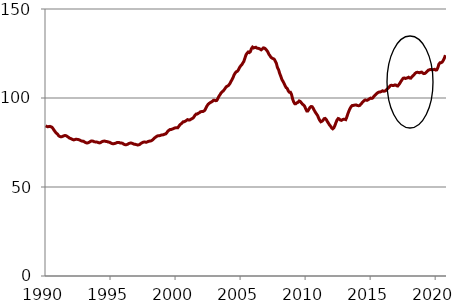
| Category | Series 0 |
|---|---|
| 1990-01-01 | 84.396 |
| 1990-02-01 | 84.066 |
| 1990-03-01 | 83.831 |
| 1990-04-01 | 83.972 |
| 1990-05-01 | 84.059 |
| 1990-06-01 | 83.83 |
| 1990-07-01 | 83.566 |
| 1990-08-01 | 82.717 |
| 1990-09-01 | 81.766 |
| 1990-10-01 | 80.944 |
| 1990-11-01 | 80.205 |
| 1990-12-01 | 79.775 |
| 1991-01-01 | 78.843 |
| 1991-02-01 | 78.432 |
| 1991-03-01 | 78.2 |
| 1991-04-01 | 78.268 |
| 1991-05-01 | 78.507 |
| 1991-06-01 | 78.777 |
| 1991-07-01 | 78.933 |
| 1991-08-01 | 78.781 |
| 1991-09-01 | 78.418 |
| 1991-10-01 | 78.007 |
| 1991-11-01 | 77.521 |
| 1991-12-01 | 77.275 |
| 1992-01-01 | 77.017 |
| 1992-02-01 | 76.694 |
| 1992-03-01 | 76.469 |
| 1992-04-01 | 76.627 |
| 1992-05-01 | 76.838 |
| 1992-06-01 | 76.768 |
| 1992-07-01 | 76.713 |
| 1992-08-01 | 76.515 |
| 1992-09-01 | 76.196 |
| 1992-10-01 | 75.897 |
| 1992-11-01 | 75.771 |
| 1992-12-01 | 75.712 |
| 1993-01-01 | 75.273 |
| 1993-02-01 | 74.944 |
| 1993-03-01 | 74.737 |
| 1993-04-01 | 74.801 |
| 1993-05-01 | 75.056 |
| 1993-06-01 | 75.424 |
| 1993-07-01 | 75.783 |
| 1993-08-01 | 75.812 |
| 1993-09-01 | 75.72 |
| 1993-10-01 | 75.383 |
| 1993-11-01 | 75.33 |
| 1993-12-01 | 75.276 |
| 1994-01-01 | 75.152 |
| 1994-02-01 | 74.903 |
| 1994-03-01 | 74.786 |
| 1994-04-01 | 75.02 |
| 1994-05-01 | 75.453 |
| 1994-06-01 | 75.665 |
| 1994-07-01 | 75.804 |
| 1994-08-01 | 75.737 |
| 1994-09-01 | 75.556 |
| 1994-10-01 | 75.472 |
| 1994-11-01 | 75.244 |
| 1994-12-01 | 75.159 |
| 1995-01-01 | 74.811 |
| 1995-02-01 | 74.481 |
| 1995-03-01 | 74.316 |
| 1995-04-01 | 74.341 |
| 1995-05-01 | 74.493 |
| 1995-06-01 | 74.693 |
| 1995-07-01 | 75.009 |
| 1995-08-01 | 75.036 |
| 1995-09-01 | 74.966 |
| 1995-10-01 | 74.712 |
| 1995-11-01 | 74.673 |
| 1995-12-01 | 74.614 |
| 1996-01-01 | 74.1 |
| 1996-02-01 | 73.836 |
| 1996-03-01 | 73.696 |
| 1996-04-01 | 73.826 |
| 1996-05-01 | 74.112 |
| 1996-06-01 | 74.466 |
| 1996-07-01 | 74.655 |
| 1996-08-01 | 74.715 |
| 1996-09-01 | 74.528 |
| 1996-10-01 | 74.229 |
| 1996-11-01 | 74.024 |
| 1996-12-01 | 73.965 |
| 1997-01-01 | 73.768 |
| 1997-02-01 | 73.595 |
| 1997-03-01 | 73.688 |
| 1997-04-01 | 73.955 |
| 1997-05-01 | 74.478 |
| 1997-06-01 | 74.853 |
| 1997-07-01 | 75.148 |
| 1997-08-01 | 75.278 |
| 1997-09-01 | 75.23 |
| 1997-10-01 | 75.128 |
| 1997-11-01 | 75.369 |
| 1997-12-01 | 75.651 |
| 1998-01-01 | 75.785 |
| 1998-02-01 | 75.827 |
| 1998-03-01 | 76.124 |
| 1998-04-01 | 76.571 |
| 1998-05-01 | 77.134 |
| 1998-06-01 | 77.746 |
| 1998-07-01 | 78.223 |
| 1998-08-01 | 78.598 |
| 1998-09-01 | 78.799 |
| 1998-10-01 | 78.82 |
| 1998-11-01 | 78.989 |
| 1998-12-01 | 79.248 |
| 1999-01-01 | 79.285 |
| 1999-02-01 | 79.416 |
| 1999-03-01 | 79.712 |
| 1999-04-01 | 79.835 |
| 1999-05-01 | 80.617 |
| 1999-06-01 | 81.465 |
| 1999-07-01 | 81.92 |
| 1999-08-01 | 82.317 |
| 1999-09-01 | 82.346 |
| 1999-10-01 | 82.561 |
| 1999-11-01 | 82.776 |
| 1999-12-01 | 83.105 |
| 2000-01-01 | 83.235 |
| 2000-02-01 | 83.217 |
| 2000-03-01 | 83.271 |
| 2000-04-01 | 84.103 |
| 2000-05-01 | 84.956 |
| 2000-06-01 | 85.452 |
| 2000-07-01 | 85.959 |
| 2000-08-01 | 86.609 |
| 2000-09-01 | 86.657 |
| 2000-10-01 | 86.986 |
| 2000-11-01 | 87.39 |
| 2000-12-01 | 87.845 |
| 2001-01-01 | 87.632 |
| 2001-02-01 | 87.625 |
| 2001-03-01 | 88.026 |
| 2001-04-01 | 88.355 |
| 2001-05-01 | 88.713 |
| 2001-06-01 | 89.408 |
| 2001-07-01 | 90.416 |
| 2001-08-01 | 91.018 |
| 2001-09-01 | 90.985 |
| 2001-10-01 | 91.463 |
| 2001-11-01 | 91.742 |
| 2001-12-01 | 92.278 |
| 2002-01-01 | 92.373 |
| 2002-02-01 | 92.39 |
| 2002-03-01 | 92.669 |
| 2002-04-01 | 93.153 |
| 2002-05-01 | 94.387 |
| 2002-06-01 | 95.54 |
| 2002-07-01 | 96.49 |
| 2002-08-01 | 96.98 |
| 2002-09-01 | 97.412 |
| 2002-10-01 | 97.749 |
| 2002-11-01 | 98.141 |
| 2002-12-01 | 98.753 |
| 2003-01-01 | 98.706 |
| 2003-02-01 | 98.47 |
| 2003-03-01 | 98.631 |
| 2003-04-01 | 99.747 |
| 2003-05-01 | 100.944 |
| 2003-06-01 | 101.894 |
| 2003-07-01 | 102.869 |
| 2003-08-01 | 103.482 |
| 2003-09-01 | 103.99 |
| 2003-10-01 | 104.786 |
| 2003-11-01 | 105.672 |
| 2003-12-01 | 106.445 |
| 2004-01-01 | 106.745 |
| 2004-02-01 | 107.171 |
| 2004-03-01 | 108.022 |
| 2004-04-01 | 109.245 |
| 2004-05-01 | 110.21 |
| 2004-06-01 | 111.478 |
| 2004-07-01 | 113.004 |
| 2004-08-01 | 114.039 |
| 2004-09-01 | 114.757 |
| 2004-10-01 | 115.033 |
| 2004-11-01 | 115.855 |
| 2004-12-01 | 117.148 |
| 2005-01-01 | 117.978 |
| 2005-02-01 | 118.616 |
| 2005-03-01 | 119.622 |
| 2005-04-01 | 120.572 |
| 2005-05-01 | 122.536 |
| 2005-06-01 | 124.258 |
| 2005-07-01 | 125.182 |
| 2005-08-01 | 125.851 |
| 2005-09-01 | 125.524 |
| 2005-10-01 | 126.078 |
| 2005-11-01 | 127.754 |
| 2005-12-01 | 128.583 |
| 2006-01-01 | 128.121 |
| 2006-02-01 | 128.338 |
| 2006-03-01 | 128.51 |
| 2006-04-01 | 128.052 |
| 2006-05-01 | 127.928 |
| 2006-06-01 | 127.791 |
| 2006-07-01 | 127.457 |
| 2006-08-01 | 127.067 |
| 2006-09-01 | 127.551 |
| 2006-10-01 | 128.147 |
| 2006-11-01 | 128.043 |
| 2006-12-01 | 127.572 |
| 2007-01-01 | 126.829 |
| 2007-02-01 | 125.983 |
| 2007-03-01 | 124.656 |
| 2007-04-01 | 123.808 |
| 2007-05-01 | 122.89 |
| 2007-06-01 | 122.421 |
| 2007-07-01 | 122.084 |
| 2007-08-01 | 121.796 |
| 2007-09-01 | 120.711 |
| 2007-10-01 | 119.382 |
| 2007-11-01 | 117.094 |
| 2007-12-01 | 115.952 |
| 2008-01-01 | 113.874 |
| 2008-02-01 | 112.293 |
| 2008-03-01 | 110.48 |
| 2008-04-01 | 109.435 |
| 2008-05-01 | 108.325 |
| 2008-06-01 | 106.934 |
| 2008-07-01 | 105.85 |
| 2008-08-01 | 105.354 |
| 2008-09-01 | 103.979 |
| 2008-10-01 | 103.255 |
| 2008-11-01 | 103.226 |
| 2008-12-01 | 101.948 |
| 2009-01-01 | 99.389 |
| 2009-02-01 | 97.742 |
| 2009-03-01 | 96.777 |
| 2009-04-01 | 96.819 |
| 2009-05-01 | 97.346 |
| 2009-06-01 | 97.575 |
| 2009-07-01 | 98.35 |
| 2009-08-01 | 98.075 |
| 2009-09-01 | 97.337 |
| 2009-10-01 | 96.567 |
| 2009-11-01 | 96.081 |
| 2009-12-01 | 95.423 |
| 2010-01-01 | 94.02 |
| 2010-02-01 | 92.734 |
| 2010-03-01 | 92.705 |
| 2010-04-01 | 93.707 |
| 2010-05-01 | 94.687 |
| 2010-06-01 | 95.209 |
| 2010-07-01 | 95.097 |
| 2010-08-01 | 94.233 |
| 2010-09-01 | 93.009 |
| 2010-10-01 | 91.944 |
| 2010-11-01 | 91.066 |
| 2010-12-01 | 90.15 |
| 2011-01-01 | 88.71 |
| 2011-02-01 | 87.447 |
| 2011-03-01 | 86.634 |
| 2011-04-01 | 86.934 |
| 2011-05-01 | 87.479 |
| 2011-06-01 | 88.352 |
| 2011-07-01 | 88.52 |
| 2011-08-01 | 87.932 |
| 2011-09-01 | 86.797 |
| 2011-10-01 | 85.886 |
| 2011-11-01 | 84.876 |
| 2011-12-01 | 84.153 |
| 2012-01-01 | 83.164 |
| 2012-02-01 | 82.695 |
| 2012-03-01 | 83.217 |
| 2012-04-01 | 84.559 |
| 2012-05-01 | 86.233 |
| 2012-06-01 | 87.657 |
| 2012-07-01 | 88.482 |
| 2012-08-01 | 88.249 |
| 2012-09-01 | 87.647 |
| 2012-10-01 | 87.446 |
| 2012-11-01 | 87.858 |
| 2012-12-01 | 88.039 |
| 2013-01-01 | 88.049 |
| 2013-02-01 | 87.848 |
| 2013-03-01 | 89.31 |
| 2013-04-01 | 91.223 |
| 2013-05-01 | 92.807 |
| 2013-06-01 | 94.129 |
| 2013-07-01 | 95.211 |
| 2013-08-01 | 95.761 |
| 2013-09-01 | 95.816 |
| 2013-10-01 | 95.992 |
| 2013-11-01 | 96.071 |
| 2013-12-01 | 96.03 |
| 2014-01-01 | 95.73 |
| 2014-02-01 | 95.68 |
| 2014-03-01 | 95.853 |
| 2014-04-01 | 96.595 |
| 2014-05-01 | 97.272 |
| 2014-06-01 | 97.989 |
| 2014-07-01 | 98.568 |
| 2014-08-01 | 98.917 |
| 2014-09-01 | 98.721 |
| 2014-10-01 | 98.775 |
| 2014-11-01 | 99.163 |
| 2014-12-01 | 99.614 |
| 2015-01-01 | 99.964 |
| 2015-02-01 | 99.764 |
| 2015-03-01 | 100.04 |
| 2015-04-01 | 100.95 |
| 2015-05-01 | 101.545 |
| 2015-06-01 | 102.129 |
| 2015-07-01 | 102.735 |
| 2015-08-01 | 103.143 |
| 2015-09-01 | 103.371 |
| 2015-10-01 | 103.425 |
| 2015-11-01 | 103.703 |
| 2015-12-01 | 104.046 |
| 2016-01-01 | 103.826 |
| 2016-02-01 | 103.884 |
| 2016-03-01 | 104.216 |
| 2016-04-01 | 104.834 |
| 2016-05-01 | 105.492 |
| 2016-06-01 | 106.067 |
| 2016-07-01 | 106.887 |
| 2016-08-01 | 107.163 |
| 2016-09-01 | 107.075 |
| 2016-10-01 | 106.987 |
| 2016-11-01 | 107.279 |
| 2016-12-01 | 107.345 |
| 2017-01-01 | 106.872 |
| 2017-02-01 | 106.751 |
| 2017-03-01 | 107.529 |
| 2017-04-01 | 108.359 |
| 2017-05-01 | 109.412 |
| 2017-06-01 | 110.31 |
| 2017-07-01 | 111.107 |
| 2017-08-01 | 111.257 |
| 2017-09-01 | 110.939 |
| 2017-10-01 | 111.16 |
| 2017-11-01 | 111.366 |
| 2017-12-01 | 111.657 |
| 2018-01-01 | 111.205 |
| 2018-02-01 | 111.149 |
| 2018-03-01 | 111.836 |
| 2018-04-01 | 112.538 |
| 2018-05-01 | 113.098 |
| 2018-06-01 | 113.806 |
| 2018-07-01 | 114.305 |
| 2018-08-01 | 114.454 |
| 2018-09-01 | 114.353 |
| 2018-10-01 | 114.155 |
| 2018-11-01 | 114.398 |
| 2018-12-01 | 114.541 |
| 2019-01-01 | 114.05 |
| 2019-02-01 | 113.697 |
| 2019-03-01 | 113.802 |
| 2019-04-01 | 114.252 |
| 2019-05-01 | 114.92 |
| 2019-06-01 | 115.58 |
| 2019-07-01 | 115.801 |
| 2019-08-01 | 116.005 |
| 2019-09-01 | 116.014 |
| 2019-10-01 | 115.799 |
| 2019-11-01 | 115.937 |
| 2019-12-01 | 116.111 |
| 2020-01-01 | 115.703 |
| 2020-02-01 | 115.817 |
| 2020-03-01 | 117.141 |
| 2020-04-01 | 119.093 |
| 2020-05-01 | 119.78 |
| 2020-06-01 | 119.849 |
| 2020-07-01 | 120.194 |
| 2020-08-01 | 121.169 |
| 2020-09-01 | 122.44 |
| 2020-10-01 | 124.067 |